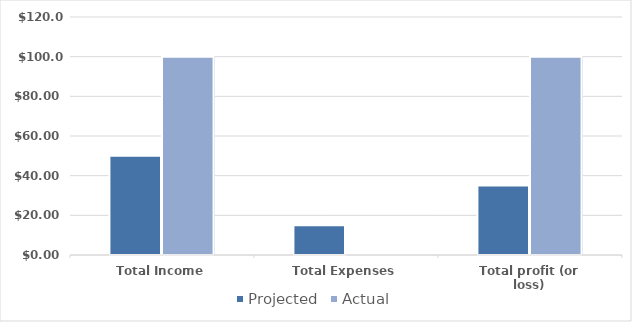
| Category | Projected | Actual |
|---|---|---|
| Total Income | 50 | 100 |
| Total Expenses | 15 | 0 |
| Total profit (or loss) | 35 | 100 |